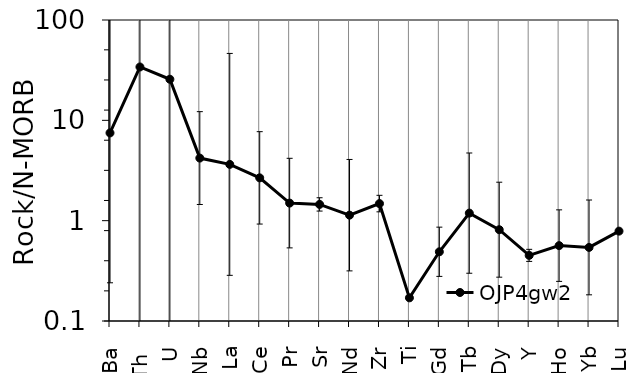
| Category | OJP4gw2  |
|---|---|
| Ba | 7.489 |
| Th  | 34.024 |
| U | 25.676 |
| Nb | 4.205 |
| La | 3.639 |
| Ce | 2.671 |
| Pr | 1.497 |
| Sr | 1.452 |
| Nd | 1.134 |
| Zr | 1.48 |
| Ti | 0.17 |
| Gd | 0.49 |
| Tb | 1.189 |
| Dy | 0.813 |
| Y | 0.451 |
| Ho | 0.564 |
| Yb | 0.541 |
| Lu | 0.786 |